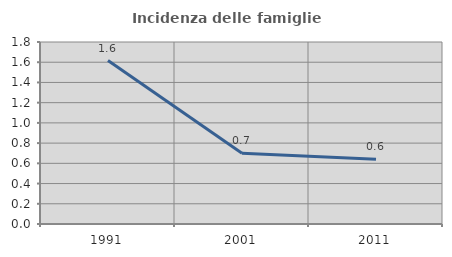
| Category | Incidenza delle famiglie numerose |
|---|---|
| 1991.0 | 1.616 |
| 2001.0 | 0.699 |
| 2011.0 | 0.64 |